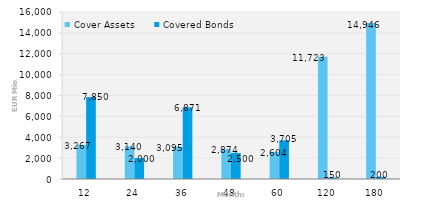
| Category | Cover Assets | Covered Bonds |
|---|---|---|
| 12.0 | 3267.311 | 7850 |
| 24.0 | 3140.496 | 2000 |
| 36.0 | 3095.061 | 6871.282 |
| 48.0 | 2873.524 | 2500 |
| 60.0 | 2603.734 | 3704.5 |
| 120.0 | 11723.366 | 150 |
| 180.0 | 14945.508 | 200 |